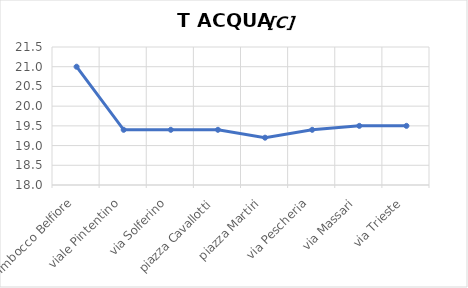
| Category | T ACQUA [C] |
|---|---|
| Imbocco Belfiore | 21 |
| viale Pintentino | 19.4 |
| via Solferino | 19.4 |
| piazza Cavallotti | 19.4 |
| piazza Martiri | 19.2 |
| via Pescheria | 19.4 |
| via Massari | 19.5 |
| via Trieste | 19.5 |